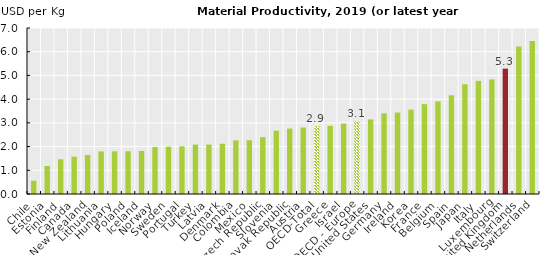
| Category | USD Per KG |
|---|---|
| Chile | 0.562 |
| Estonia | 1.182 |
| Finland | 1.465 |
| Canada | 1.576 |
| New Zealand | 1.643 |
| Lithuania | 1.796 |
| Hungary | 1.8 |
| Poland | 1.804 |
| Iceland | 1.817 |
| Norway | 1.986 |
| Sweden | 1.998 |
| Portugal | 2.012 |
| Turkey | 2.083 |
| Latvia | 2.084 |
| Denmark | 2.12 |
| Colombia | 2.264 |
| Mexico | 2.267 |
| Czech Republic | 2.399 |
| Slovenia | 2.67 |
| Slovak Republic | 2.757 |
| Austria | 2.803 |
| OECD-Total | 2.865 |
| Greece | 2.877 |
| Israel | 2.968 |
| OECD - Europe | 3.059 |
| United States | 3.145 |
| Germany | 3.401 |
| Ireland | 3.436 |
| Korea | 3.56 |
| France | 3.789 |
| Belgium | 3.906 |
| Spain | 4.162 |
| Japan | 4.628 |
| Italy | 4.77 |
| Luxembourg | 4.834 |
| United Kingdom | 5.286 |
| Netherlands | 6.222 |
| Switzerland | 6.448 |